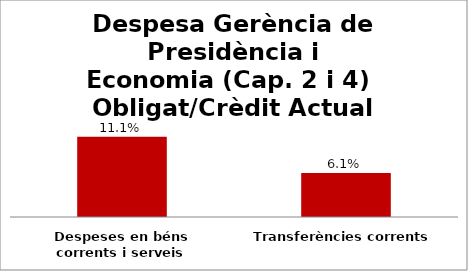
| Category | Series 0 |
|---|---|
| Despeses en béns corrents i serveis | 0.111 |
| Transferències corrents | 0.061 |